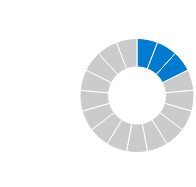
| Category | Private customer |
|---|---|
| 0 | 1 |
| 1 | 1 |
| 2 | 1 |
| 3 | 1 |
| 4 | 1 |
| 5 | 1 |
| 6 | 1 |
| 7 | 1 |
| 8 | 1 |
| 9 | 1 |
| 10 | 1 |
| 11 | 1 |
| 12 | 1 |
| 13 | 1 |
| 14 | 1 |
| 15 | 1 |
| 16 | 1 |